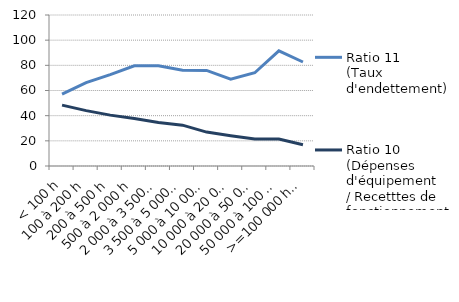
| Category | Ratio 11
(Taux d'endettement) | Ratio 10 
(Dépenses d'équipement
/ Recetttes de fonctionnement) |
|---|---|---|
| < 100 h | 57.069 | 48.359 |
| 100 à 200 h | 66.227 | 43.989 |
| 200 à 500 h | 72.603 | 40.423 |
| 500 à 2 000 h | 79.659 | 37.732 |
| 2 000 à 3 500 h | 79.572 | 34.538 |
| 3 500 à 5 000 h | 76.07 | 32.455 |
| 5 000 à 10 000 h | 75.977 | 26.958 |
| 10 000 à 20 000 h | 69.03 | 24.114 |
| 20 000 à 50 000 h | 74.105 | 21.397 |
| 50 000 à 100 000 h | 91.474 | 21.505 |
| >=100 000 h hors Paris | 82.643 | 16.895 |